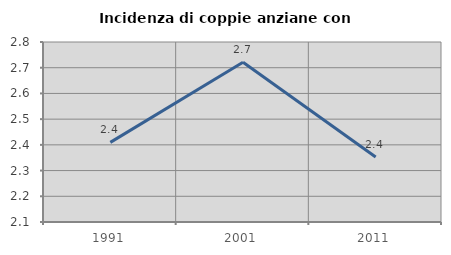
| Category | Incidenza di coppie anziane con figli |
|---|---|
| 1991.0 | 2.41 |
| 2001.0 | 2.721 |
| 2011.0 | 2.353 |